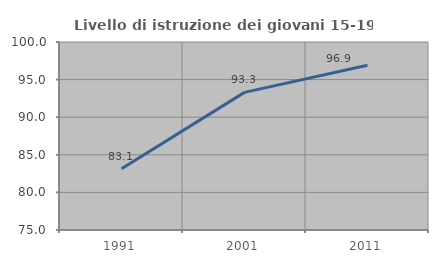
| Category | Livello di istruzione dei giovani 15-19 anni |
|---|---|
| 1991.0 | 83.146 |
| 2001.0 | 93.303 |
| 2011.0 | 96.916 |